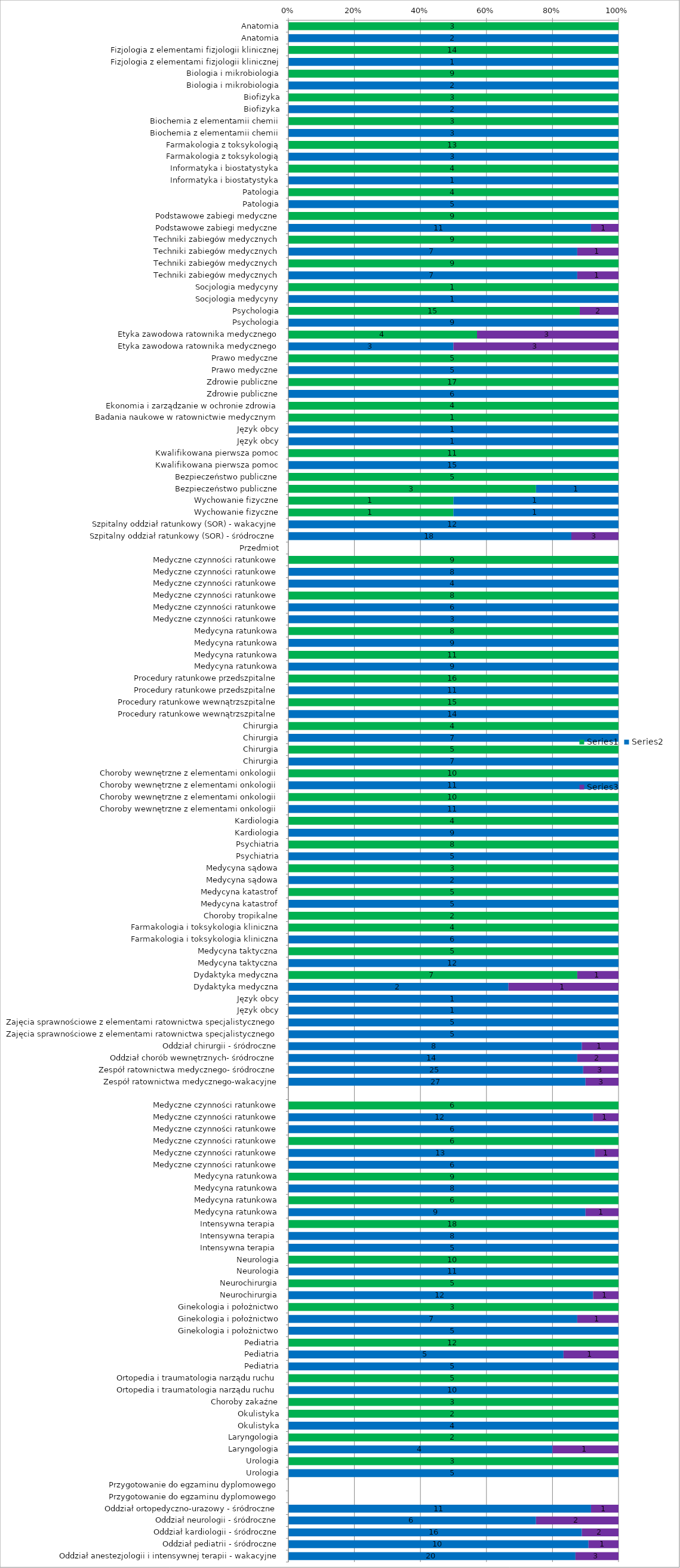
| Category | Series 0 | Series 1 | Series 2 |
|---|---|---|---|
| Anatomia | 3 | 0 | 0 |
| Anatomia | 0 | 2 | 0 |
| Fizjologia z elementami fizjologii klinicznej | 14 | 0 | 0 |
| Fizjologia z elementami fizjologii klinicznej | 0 | 1 | 0 |
| Biologia i mikrobiologia | 9 | 0 | 0 |
| Biologia i mikrobiologia | 0 | 2 | 0 |
| Biofizyka | 3 | 0 | 0 |
| Biofizyka | 0 | 2 | 0 |
| Biochemia z elementamii chemii | 3 | 0 | 0 |
| Biochemia z elementamii chemii | 0 | 3 | 0 |
| Farmakologia z toksykologią | 13 | 0 | 0 |
| Farmakologia z toksykologią | 0 | 3 | 0 |
| Informatyka i biostatystyka | 4 | 0 | 0 |
| Informatyka i biostatystyka | 0 | 1 | 0 |
| Patologia | 4 | 0 | 0 |
| Patologia | 0 | 5 | 0 |
| Podstawowe zabiegi medyczne | 9 | 0 | 0 |
| Podstawowe zabiegi medyczne | 0 | 11 | 1 |
| Techniki zabiegów medycznych | 9 | 0 | 0 |
| Techniki zabiegów medycznych | 0 | 7 | 1 |
| Techniki zabiegów medycznych | 9 | 0 | 0 |
| Techniki zabiegów medycznych | 0 | 7 | 1 |
| Socjologia medycyny | 1 | 0 | 0 |
| Socjologia medycyny | 0 | 1 | 0 |
| Psychologia | 15 | 0 | 2 |
| Psychologia | 0 | 9 | 0 |
| Etyka zawodowa ratownika medycznego | 4 | 0 | 3 |
| Etyka zawodowa ratownika medycznego | 0 | 3 | 3 |
| Prawo medyczne | 5 | 0 | 0 |
| Prawo medyczne | 0 | 5 | 0 |
| Zdrowie publiczne | 17 | 0 | 0 |
| Zdrowie publiczne | 0 | 6 | 0 |
| Ekonomia i zarządzanie w ochronie zdrowia | 4 | 0 | 0 |
| Badania naukowe w ratownictwie medycznym | 1 | 0 | 0 |
| Język obcy | 0 | 1 | 0 |
| Język obcy | 0 | 1 | 0 |
| Kwalifikowana pierwsza pomoc | 11 | 0 | 0 |
| Kwalifikowana pierwsza pomoc | 0 | 15 | 0 |
| Bezpieczeństwo publiczne | 5 | 0 | 0 |
| Bezpieczeństwo publiczne | 3 | 1 | 0 |
| Wychowanie fizyczne | 1 | 1 | 0 |
| Wychowanie fizyczne | 1 | 1 | 0 |
| Szpitalny oddział ratunkowy (SOR) - wakacyjne | 0 | 12 | 0 |
| Szpitalny oddział ratunkowy (SOR) - śródroczne | 0 | 18 | 3 |
| Przedmiot | 0 | 0 | 0 |
| Medyczne czynności ratunkowe | 9 | 0 | 0 |
| Medyczne czynności ratunkowe | 0 | 8 | 0 |
| Medyczne czynności ratunkowe | 0 | 4 | 0 |
| Medyczne czynności ratunkowe | 8 | 0 | 0 |
| Medyczne czynności ratunkowe | 0 | 6 | 0 |
| Medyczne czynności ratunkowe | 0 | 3 | 0 |
| Medycyna ratunkowa | 8 | 0 | 0 |
| Medycyna ratunkowa | 0 | 9 | 0 |
| Medycyna ratunkowa | 11 | 0 | 0 |
| Medycyna ratunkowa | 0 | 9 | 0 |
| Procedury ratunkowe przedszpitalne | 16 | 0 | 0 |
| Procedury ratunkowe przedszpitalne | 0 | 11 | 0 |
| Procedury ratunkowe wewnątrzszpitalne | 15 | 0 | 0 |
| Procedury ratunkowe wewnątrzszpitalne | 0 | 14 | 0 |
| Chirurgia | 4 | 0 | 0 |
| Chirurgia | 0 | 7 | 0 |
| Chirurgia | 5 | 0 | 0 |
| Chirurgia | 0 | 7 | 0 |
| Choroby wewnętrzne z elementami onkologii | 10 | 0 | 0 |
| Choroby wewnętrzne z elementami onkologii | 0 | 11 | 0 |
| Choroby wewnętrzne z elementami onkologii | 10 | 0 | 0 |
| Choroby wewnętrzne z elementami onkologii | 0 | 11 | 0 |
| Kardiologia | 4 | 0 | 0 |
| Kardiologia | 0 | 9 | 0 |
| Psychiatria | 8 | 0 | 0 |
| Psychiatria | 0 | 5 | 0 |
| Medycyna sądowa | 3 | 0 | 0 |
| Medycyna sądowa | 0 | 2 | 0 |
| Medycyna katastrof | 5 | 0 | 0 |
| Medycyna katastrof | 0 | 5 | 0 |
| Choroby tropikalne | 2 | 0 | 0 |
| Farmakologia i toksykologia kliniczna | 4 | 0 | 0 |
| Farmakologia i toksykologia kliniczna | 0 | 6 | 0 |
| Medycyna taktyczna | 5 | 0 | 0 |
| Medycyna taktyczna | 0 | 12 | 0 |
| Dydaktyka medyczna | 7 | 0 | 1 |
| Dydaktyka medyczna | 0 | 2 | 1 |
| Język obcy | 0 | 1 | 0 |
| Język obcy | 0 | 1 | 0 |
| Zajęcia sprawnościowe z elementami ratownictwa specjalistycznego | 0 | 5 | 0 |
| Zajęcia sprawnościowe z elementami ratownictwa specjalistycznego | 0 | 5 | 0 |
| Oddział chirurgii - śródroczne | 0 | 8 | 1 |
| Oddział chorób wewnętrznych- śródroczne | 0 | 14 | 2 |
| Zespół ratownictwa medycznego- śródroczne | 0 | 25 | 3 |
| Zespół ratownictwa medycznego-wakacyjne | 0 | 27 | 3 |
|  | 0 | 0 | 0 |
| Medyczne czynności ratunkowe | 6 | 0 | 0 |
| Medyczne czynności ratunkowe | 0 | 12 | 1 |
| Medyczne czynności ratunkowe | 0 | 6 | 0 |
| Medyczne czynności ratunkowe | 6 | 0 | 0 |
| Medyczne czynności ratunkowe | 0 | 13 | 1 |
| Medyczne czynności ratunkowe | 0 | 6 | 0 |
| Medycyna ratunkowa | 9 | 0 | 0 |
| Medycyna ratunkowa | 0 | 8 | 0 |
| Medycyna ratunkowa | 6 | 0 | 0 |
| Medycyna ratunkowa | 0 | 9 | 1 |
| Intensywna terapia  | 18 | 0 | 0 |
| Intensywna terapia  | 0 | 8 | 0 |
| Intensywna terapia  | 0 | 5 | 0 |
| Neurologia | 10 | 0 | 0 |
| Neurologia | 0 | 11 | 0 |
| Neurochirurgia | 5 | 0 | 0 |
| Neurochirurgia | 0 | 12 | 1 |
| Ginekologia i położnictwo | 3 | 0 | 0 |
| Ginekologia i położnictwo | 0 | 7 | 1 |
| Ginekologia i położnictwo | 0 | 5 | 0 |
| Pediatria | 12 | 0 | 0 |
| Pediatria | 0 | 5 | 1 |
| Pediatria | 0 | 5 | 0 |
| Ortopedia i traumatologia narządu ruchu | 5 | 0 | 0 |
| Ortopedia i traumatologia narządu ruchu | 0 | 10 | 0 |
| Choroby zakaźne | 3 | 0 | 0 |
| Okulistyka | 2 | 0 | 0 |
| Okulistyka | 0 | 4 | 0 |
| Laryngologia | 2 | 0 | 0 |
| Laryngologia | 0 | 4 | 1 |
| Urologia | 3 | 0 | 0 |
| Urologia | 0 | 5 | 0 |
| Przygotowanie do egzaminu dyplomowego | 0 | 0 | 0 |
| Przygotowanie do egzaminu dyplomowego | 0 | 0 | 0 |
| Oddział ortopedyczno-urazowy - śródroczne | 0 | 11 | 1 |
| Oddział neurologii - śródroczne | 0 | 6 | 2 |
| Oddział kardiologii - śródroczne | 0 | 16 | 2 |
| Oddział pediatrii - śródroczne | 0 | 10 | 1 |
| Oddział anestezjologii i intensywnej terapii - wakacyjne | 0 | 20 | 3 |